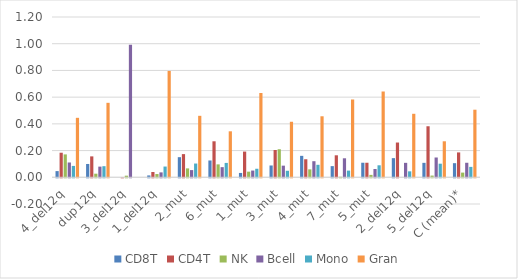
| Category | CD8T | CD4T | NK | Bcell | Mono | Gran |
|---|---|---|---|---|---|---|
| 4_del12q | 0.046 | 0.184 | 0.171 | 0.111 | 0.085 | 0.445 |
| dup12q | 0.1 | 0.157 | 0.027 | 0.08 | 0.083 | 0.557 |
| 3_del12q | 0 | 0 | 0.012 | 0.992 | 0 | 0 |
| 1_del12q | 0.014 | 0.039 | 0.024 | 0.037 | 0.08 | 0.796 |
| 2_mut | 0.151 | 0.173 | 0.067 | 0.054 | 0.103 | 0.46 |
| 6_mut | 0.126 | 0.27 | 0.097 | 0.076 | 0.108 | 0.344 |
| 1_mut | 0.032 | 0.192 | 0.042 | 0.05 | 0.064 | 0.631 |
| 3_mut | 0.088 | 0.204 | 0.21 | 0.087 | 0.049 | 0.416 |
| 4_mut | 0.16 | 0.135 | 0.059 | 0.12 | 0.093 | 0.457 |
| 7_mut | 0.084 | 0.165 | 0.004 | 0.142 | 0.05 | 0.582 |
| 5_mut | 0.109 | 0.109 | 0.018 | 0.062 | 0.09 | 0.642 |
| 2_del12q | 0.143 | 0.26 | 0 | 0.108 | 0.045 | 0.475 |
| 5_del12q | 0.108 | 0.382 | 0.013 | 0.148 | 0.102 | 0.27 |
| C (mean)* | 0.106 | 0.186 | 0.035 | 0.109 | 0.078 | 0.506 |